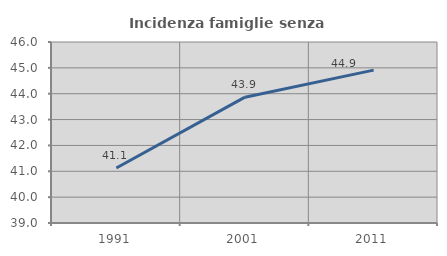
| Category | Incidenza famiglie senza nuclei |
|---|---|
| 1991.0 | 41.126 |
| 2001.0 | 43.866 |
| 2011.0 | 44.912 |